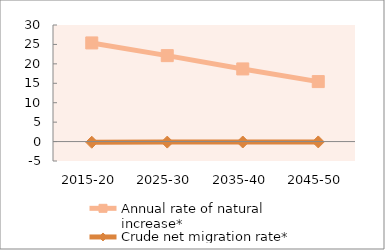
| Category | Annual rate of natural increase* | Crude net migration rate* |
|---|---|---|
| 2015-20 | 25.387 | -0.172 |
| 2025-30 | 22.115 | -0.136 |
| 2035-40 | 18.695 | -0.111 |
| 2045-50 | 15.436 | -0.094 |